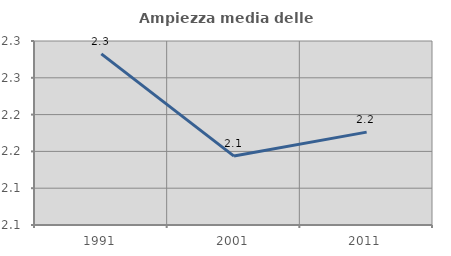
| Category | Ampiezza media delle famiglie |
|---|---|
| 1991.0 | 2.282 |
| 2001.0 | 2.144 |
| 2011.0 | 2.176 |